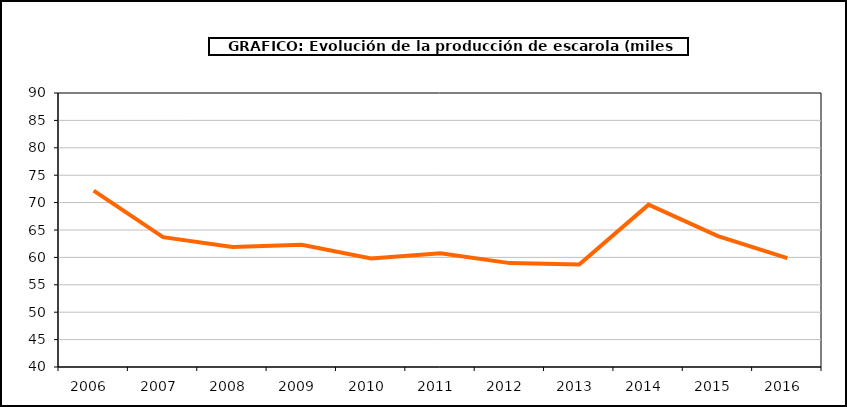
| Category | producción |
|---|---|
| 2006.0 | 72.187 |
| 2007.0 | 63.686 |
| 2008.0 | 61.886 |
| 2009.0 | 62.3 |
| 2010.0 | 59.803 |
| 2011.0 | 60.737 |
| 2012.0 | 58.957 |
| 2013.0 | 58.687 |
| 2014.0 | 69.619 |
| 2015.0 | 63.882 |
| 2016.0 | 59.873 |